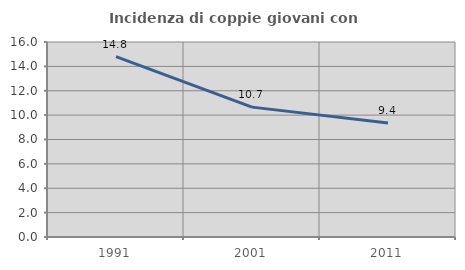
| Category | Incidenza di coppie giovani con figli |
|---|---|
| 1991.0 | 14.804 |
| 2001.0 | 10.657 |
| 2011.0 | 9.361 |